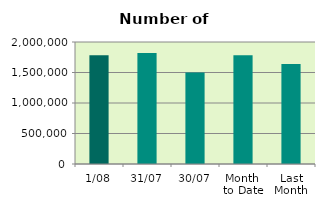
| Category | Series 0 |
|---|---|
| 1/08 | 1781394 |
| 31/07 | 1821512 |
| 30/07 | 1501268 |
| Month 
to Date | 1781394 |
| Last
Month | 1640369.455 |